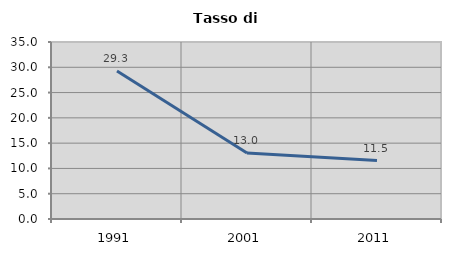
| Category | Tasso di disoccupazione   |
|---|---|
| 1991.0 | 29.27 |
| 2001.0 | 13.043 |
| 2011.0 | 11.548 |